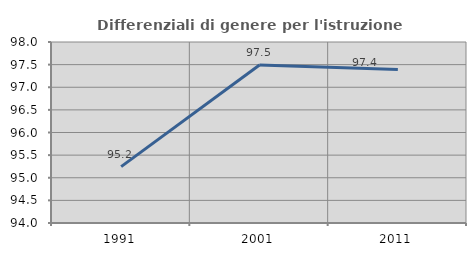
| Category | Differenziali di genere per l'istruzione superiore |
|---|---|
| 1991.0 | 95.246 |
| 2001.0 | 97.494 |
| 2011.0 | 97.391 |